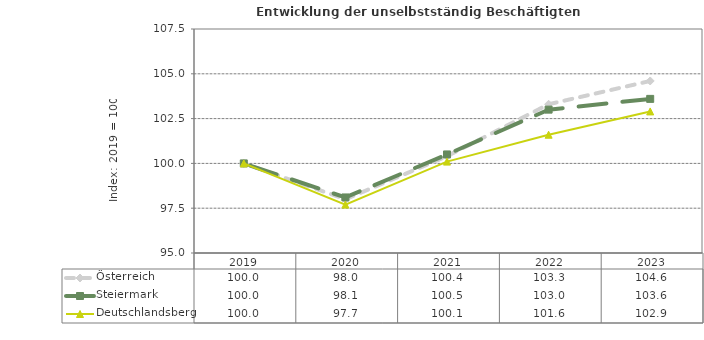
| Category | Österreich | Steiermark | Deutschlandsberg |
|---|---|---|---|
| 2023.0 | 104.6 | 103.6 | 102.9 |
| 2022.0 | 103.3 | 103 | 101.6 |
| 2021.0 | 100.4 | 100.5 | 100.1 |
| 2020.0 | 98 | 98.1 | 97.7 |
| 2019.0 | 100 | 100 | 100 |